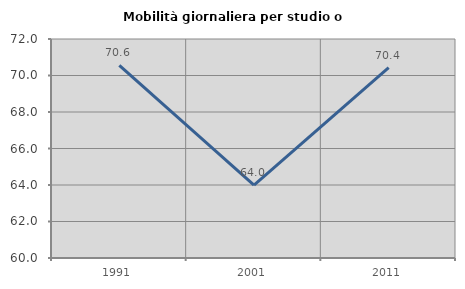
| Category | Mobilità giornaliera per studio o lavoro |
|---|---|
| 1991.0 | 70.561 |
| 2001.0 | 63.992 |
| 2011.0 | 70.431 |